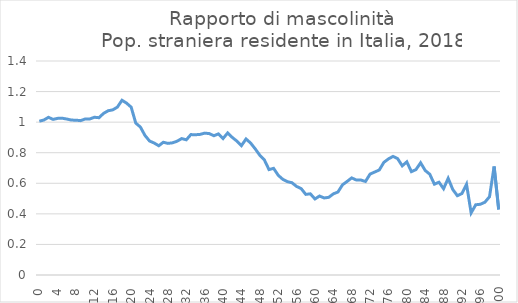
| Category | Series 0 |
|---|---|
| 0.0 | 1.006 |
| 1.0 | 1.014 |
| 2.0 | 1.032 |
| 3.0 | 1.018 |
| 4.0 | 1.025 |
| 5.0 | 1.026 |
| 6.0 | 1.02 |
| 7.0 | 1.013 |
| 8.0 | 1.013 |
| 9.0 | 1.01 |
| 10.0 | 1.021 |
| 11.0 | 1.021 |
| 12.0 | 1.032 |
| 13.0 | 1.029 |
| 14.0 | 1.058 |
| 15.0 | 1.075 |
| 16.0 | 1.08 |
| 17.0 | 1.098 |
| 18.0 | 1.143 |
| 19.0 | 1.124 |
| 20.0 | 1.098 |
| 21.0 | 0.994 |
| 22.0 | 0.968 |
| 23.0 | 0.913 |
| 24.0 | 0.877 |
| 25.0 | 0.863 |
| 26.0 | 0.846 |
| 27.0 | 0.868 |
| 28.0 | 0.861 |
| 29.0 | 0.865 |
| 30.0 | 0.875 |
| 31.0 | 0.893 |
| 32.0 | 0.885 |
| 33.0 | 0.919 |
| 34.0 | 0.918 |
| 35.0 | 0.92 |
| 36.0 | 0.928 |
| 37.0 | 0.925 |
| 38.0 | 0.911 |
| 39.0 | 0.923 |
| 40.0 | 0.893 |
| 41.0 | 0.929 |
| 42.0 | 0.9 |
| 43.0 | 0.876 |
| 44.0 | 0.846 |
| 45.0 | 0.89 |
| 46.0 | 0.863 |
| 47.0 | 0.825 |
| 48.0 | 0.783 |
| 49.0 | 0.752 |
| 50.0 | 0.69 |
| 51.0 | 0.698 |
| 52.0 | 0.652 |
| 53.0 | 0.626 |
| 54.0 | 0.611 |
| 55.0 | 0.603 |
| 56.0 | 0.579 |
| 57.0 | 0.565 |
| 58.0 | 0.527 |
| 59.0 | 0.531 |
| 60.0 | 0.497 |
| 61.0 | 0.517 |
| 62.0 | 0.504 |
| 63.0 | 0.508 |
| 64.0 | 0.531 |
| 65.0 | 0.543 |
| 66.0 | 0.59 |
| 67.0 | 0.612 |
| 68.0 | 0.635 |
| 69.0 | 0.621 |
| 70.0 | 0.621 |
| 71.0 | 0.612 |
| 72.0 | 0.66 |
| 73.0 | 0.674 |
| 74.0 | 0.687 |
| 75.0 | 0.737 |
| 76.0 | 0.759 |
| 77.0 | 0.776 |
| 78.0 | 0.761 |
| 79.0 | 0.714 |
| 80.0 | 0.74 |
| 81.0 | 0.676 |
| 82.0 | 0.69 |
| 83.0 | 0.734 |
| 84.0 | 0.684 |
| 85.0 | 0.659 |
| 86.0 | 0.594 |
| 87.0 | 0.607 |
| 88.0 | 0.565 |
| 89.0 | 0.633 |
| 90.0 | 0.559 |
| 91.0 | 0.519 |
| 92.0 | 0.533 |
| 93.0 | 0.593 |
| 94.0 | 0.406 |
| 95.0 | 0.459 |
| 96.0 | 0.463 |
| 97.0 | 0.476 |
| 98.0 | 0.512 |
| 99.0 | 0.71 |
| 100.0 | 0.429 |